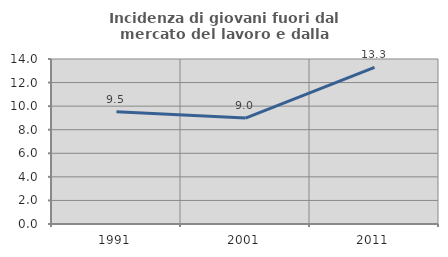
| Category | Incidenza di giovani fuori dal mercato del lavoro e dalla formazione  |
|---|---|
| 1991.0 | 9.524 |
| 2001.0 | 8.984 |
| 2011.0 | 13.291 |